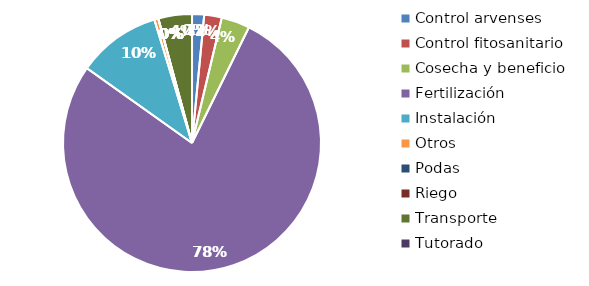
| Category | Valor |
|---|---|
| Control arvenses | 360000 |
| Control fitosanitario | 524200 |
| Cosecha y beneficio | 848000 |
| Fertilización | 18457000 |
| Instalación | 2485200 |
| Otros | 120000 |
| Podas | 0 |
| Riego | 0 |
| Transporte | 1002000 |
| Tutorado | 0 |